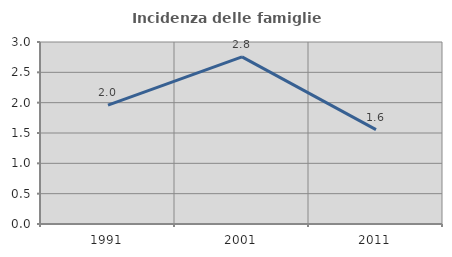
| Category | Incidenza delle famiglie numerose |
|---|---|
| 1991.0 | 1.961 |
| 2001.0 | 2.754 |
| 2011.0 | 1.556 |